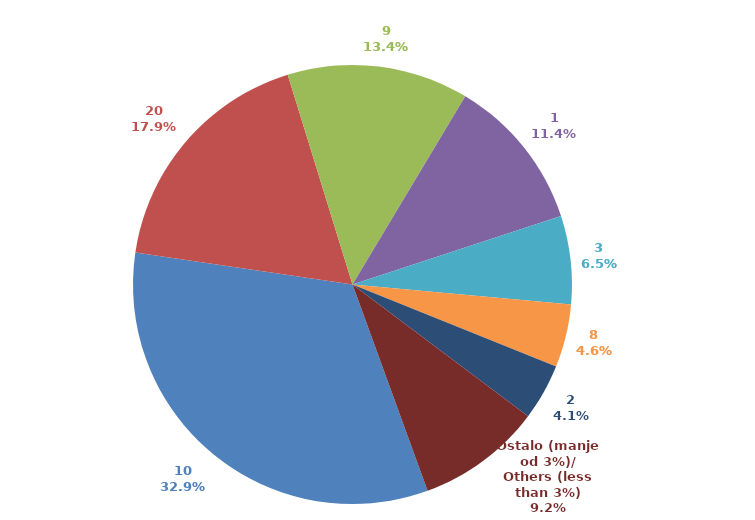
| Category | Series 0 |
|---|---|
| 10 | 0.329 |
| 20 | 0.179 |
| 9 | 0.134 |
| 1 | 0.114 |
| 3 | 0.065 |
| 8 | 0.046 |
| 2 | 0.041 |
| Ostalo (manje od 3%)/
Others (less than 3%) | 0.092 |